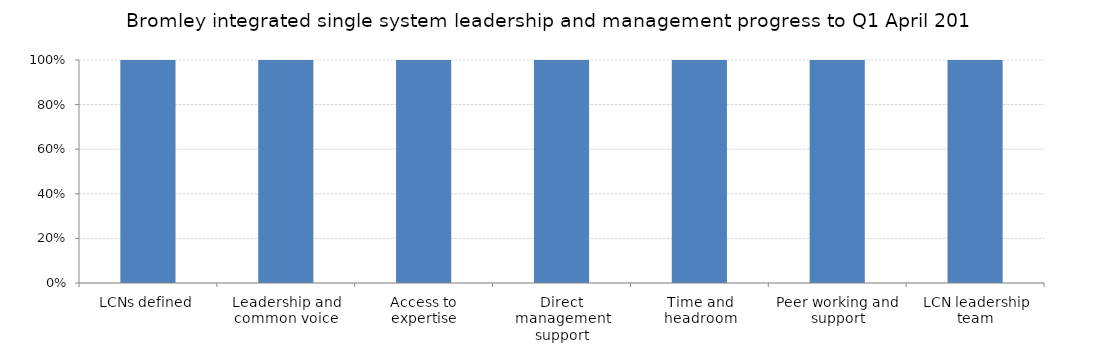
| Category | Series 0 |
|---|---|
| LCNs defined | 1 |
| Leadership and common voice | 1 |
| Access to expertise | 1 |
| Direct management support | 1 |
| Time and headroom | 1 |
| Peer working and support | 1 |
| LCN leadership team | 1 |